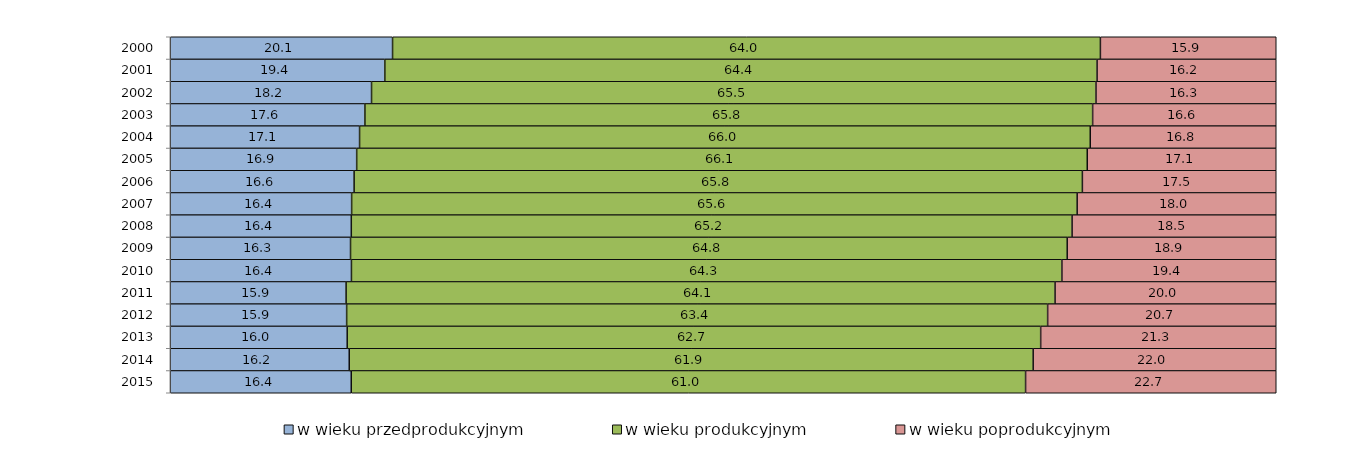
| Category | w wieku przedprodukcyjnym | w wieku produkcyjnym | w wieku poprodukcyjnym |
|---|---|---|---|
| 2000.0 | 20.1 | 64 | 15.9 |
| 2001.0 | 19.4 | 64.4 | 16.2 |
| 2002.0 | 18.2 | 65.5 | 16.3 |
| 2003.0 | 17.6 | 65.8 | 16.6 |
| 2004.0 | 17.1 | 66 | 16.8 |
| 2005.0 | 16.856 | 66.056 | 17.088 |
| 2006.0 | 16.625 | 65.847 | 17.528 |
| 2007.0 | 16.4 | 65.6 | 18 |
| 2008.0 | 16.37 | 65.17 | 18.46 |
| 2009.0 | 16.3 | 64.8 | 18.9 |
| 2010.0 | 16.4 | 64.3 | 19.4 |
| 2011.0 | 15.9 | 64.1 | 20 |
| 2012.0 | 15.949 | 63.381 | 20.67 |
| 2013.0 | 16 | 62.7 | 21.3 |
| 2014.0 | 16.2 | 61.9 | 22 |
| 2015.0 | 16.365 | 60.971 | 22.663 |